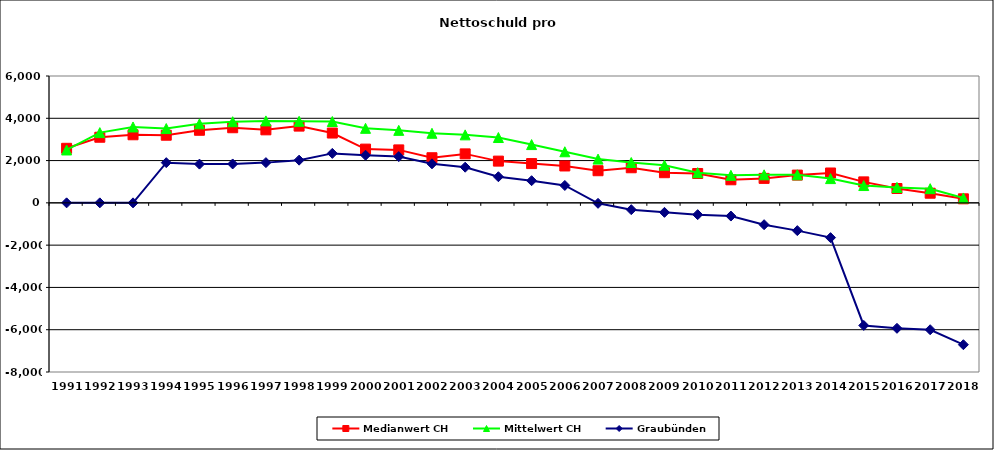
| Category | Medianwert CH | Mittelwert CH | Graubünden |
|---|---|---|---|
| 1991.0 | 2580 | 2501.231 | 0 |
| 1992.0 | 3103.5 | 3322.389 | 0 |
| 1993.0 | 3220 | 3589 | 0 |
| 1994.0 | 3199 | 3514.619 | 1901 |
| 1995.0 | 3433 | 3736.5 | 1832 |
| 1996.0 | 3553 | 3837.333 | 1840 |
| 1997.0 | 3453.5 | 3876.545 | 1903 |
| 1998.0 | 3630 | 3856.13 | 2020 |
| 1999.0 | 3302 | 3847.739 | 2340 |
| 2000.0 | 2542 | 3524.64 | 2253 |
| 2001.0 | 2505 | 3428.8 | 2189 |
| 2002.0 | 2134 | 3290.4 | 1846 |
| 2003.0 | 2316 | 3215.6 | 1687 |
| 2004.0 | 1974 | 3090.325 | 1236 |
| 2005.0 | 1858 | 2756.351 | 1048 |
| 2006.0 | 1744.5 | 2416.426 | 823 |
| 2007.0 | 1520 | 2070.521 | -23 |
| 2008.0 | 1660 | 1907.634 | -323 |
| 2009.0 | 1426 | 1780.53 | -449 |
| 2010.0 | 1388.8 | 1427.327 | -558 |
| 2011.0 | 1091 | 1302.405 | -624 |
| 2012.0 | 1157.645 | 1326.071 | -1033 |
| 2013.0 | 1313 | 1328.597 | -1314 |
| 2014.0 | 1412.435 | 1147.291 | -1645 |
| 2015.0 | 992 | 819.292 | -5799 |
| 2016.0 | 679 | 729.357 | -5933 |
| 2017.0 | 456.291 | 671.325 | -6001 |
| 2018.0 | 191 | 232.403 | -6709 |